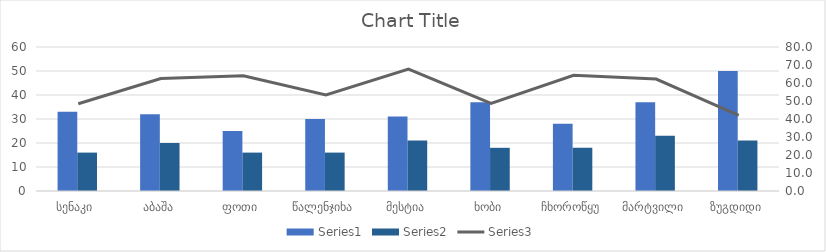
| Category | Series 0 | Series 1 | Series 2 | Series 3 | Series 4 | Series 5 | Series 6 | Series 7 |
|---|---|---|---|---|---|---|---|---|
| სენაკი |  |  |  |  | 33 |  | 16 |  |
| აბაშა |  |  |  |  | 32 |  | 20 |  |
| ფოთი |  |  |  |  | 25 |  | 16 |  |
| წალენჯიხა |  |  |  |  | 30 |  | 16 |  |
| მესტია |  |  |  |  | 31 |  | 21 |  |
| ხობი |  |  |  |  | 37 |  | 18 |  |
| ჩხოროწყუ |  |  |  |  | 28 |  | 18 |  |
| მარტვილი |  |  |  |  | 37 |  | 23 |  |
| ზუგდიდი |  |  |  |  | 50 |  | 21 |  |